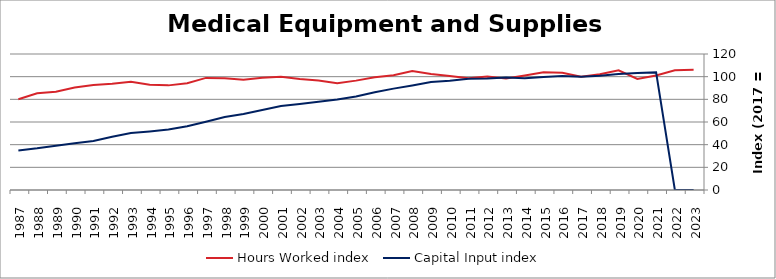
| Category | Hours Worked index | Capital Input index |
|---|---|---|
| 2023.0 | 106.017 | 0 |
| 2022.0 | 105.651 | 0 |
| 2021.0 | 101.109 | 103.779 |
| 2020.0 | 97.957 | 103.253 |
| 2019.0 | 105.575 | 102.246 |
| 2018.0 | 102.082 | 100.846 |
| 2017.0 | 100 | 100 |
| 2016.0 | 103.535 | 100.646 |
| 2015.0 | 103.863 | 99.782 |
| 2014.0 | 100.954 | 98.69 |
| 2013.0 | 98.387 | 99.351 |
| 2012.0 | 100.062 | 98.297 |
| 2011.0 | 98.621 | 98.145 |
| 2010.0 | 100.625 | 96.341 |
| 2009.0 | 102.412 | 95.269 |
| 2008.0 | 104.935 | 92.196 |
| 2007.0 | 101.177 | 89.437 |
| 2006.0 | 99.544 | 86.272 |
| 2005.0 | 96.511 | 82.538 |
| 2004.0 | 94.308 | 79.874 |
| 2003.0 | 96.577 | 77.869 |
| 2002.0 | 97.902 | 75.855 |
| 2001.0 | 99.97 | 74.162 |
| 2000.0 | 98.981 | 70.612 |
| 1999.0 | 97.224 | 67.092 |
| 1998.0 | 98.661 | 64.356 |
| 1997.0 | 98.902 | 60.267 |
| 1996.0 | 94.24 | 56.254 |
| 1995.0 | 92.318 | 53.4 |
| 1994.0 | 92.815 | 51.699 |
| 1993.0 | 95.457 | 50.359 |
| 1992.0 | 93.716 | 46.992 |
| 1991.0 | 92.594 | 43.302 |
| 1990.0 | 90.443 | 41.204 |
| 1989.0 | 86.63 | 38.997 |
| 1988.0 | 85.367 | 36.748 |
| 1987.0 | 80.055 | 34.898 |